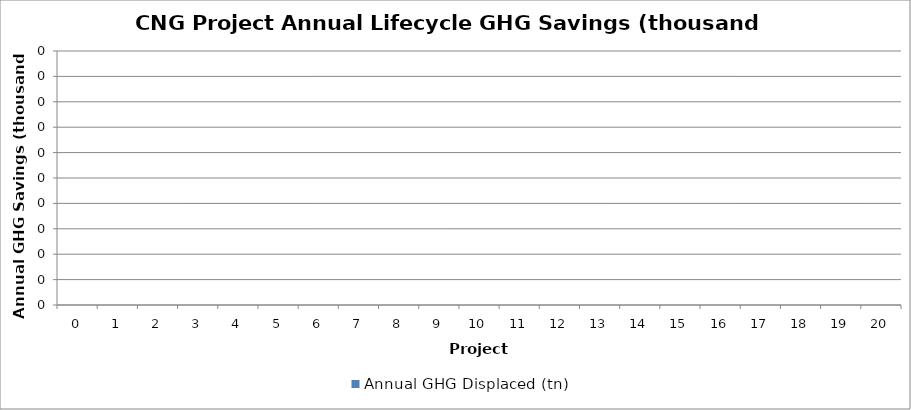
| Category | Annual GHG Displaced (tn) |
|---|---|
| 0.0 | 0 |
| 1.0 | 0 |
| 2.0 | 0 |
| 3.0 | 0 |
| 4.0 | 0 |
| 5.0 | 0 |
| 6.0 | 0 |
| 7.0 | 0 |
| 8.0 | 0 |
| 9.0 | 0 |
| 10.0 | 0 |
| 11.0 | 0 |
| 12.0 | 0 |
| 13.0 | 0 |
| 14.0 | 0 |
| 15.0 | 0 |
| 16.0 | 0 |
| 17.0 | 0 |
| 18.0 | 0 |
| 19.0 | 0 |
| 20.0 | 0 |